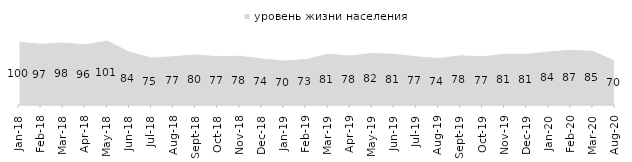
| Category | уровень жизни населения |
|---|---|
| 2018-01-01 | 99.6 |
| 2018-02-01 | 96.5 |
| 2018-03-01 | 98.45 |
| 2018-04-01 | 95.55 |
| 2018-05-01 | 101.45 |
| 2018-06-01 | 84.2 |
| 2018-07-01 | 74.9 |
| 2018-08-01 | 77.1 |
| 2018-09-01 | 79.6 |
| 2018-10-01 | 77.1 |
| 2018-11-01 | 77.745 |
| 2018-12-01 | 73.6 |
| 2019-01-01 | 70.25 |
| 2019-02-01 | 72.55 |
| 2019-03-01 | 80.806 |
| 2019-04-01 | 78.168 |
| 2019-05-01 | 82.169 |
| 2019-06-01 | 80.648 |
| 2019-07-01 | 76.881 |
| 2019-08-01 | 74.276 |
| 2019-09-01 | 78.465 |
| 2019-10-01 | 76.931 |
| 2019-11-01 | 80.842 |
| 2019-12-01 | 80.792 |
| 2020-01-01 | 84.406 |
| 2020-02-01 | 87.129 |
| 2020-03-01 | 85.275 |
| 2020-08-01 | 69.911 |